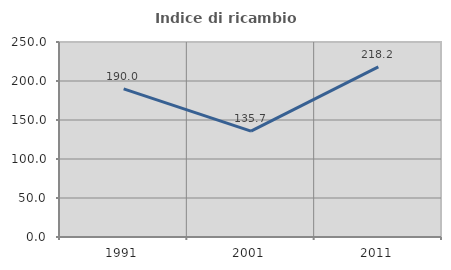
| Category | Indice di ricambio occupazionale  |
|---|---|
| 1991.0 | 190 |
| 2001.0 | 135.714 |
| 2011.0 | 218.182 |